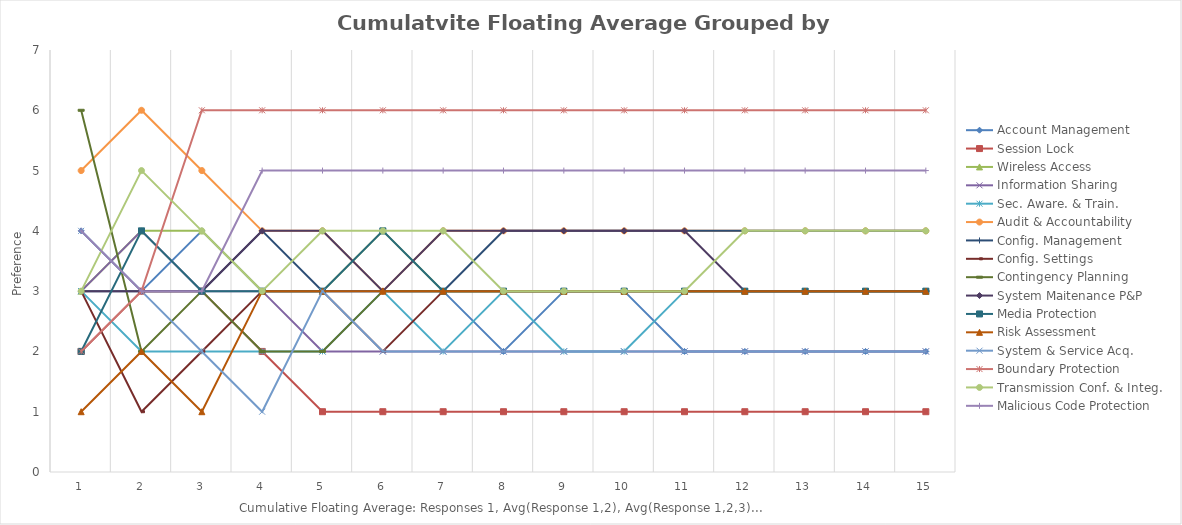
| Category | Account Management | Session Lock | Wireless Access | Information Sharing | Sec. Aware. & Train. | Audit & Accountability | Config. Management | Config. Settings | Contingency Planning | System Maitenance P&P | Media Protection | Risk Assessment | System & Service Acq. | Boundary Protection | Transmission Conf. & Integ. | Malicious Code Protection |
|---|---|---|---|---|---|---|---|---|---|---|---|---|---|---|---|---|
| 0 | 4 | 2 | 3 | 3 | 3 | 5 | 3 | 3 | 6 | 3 | 2 | 1 | 4 | 2 | 3 | 4 |
| 1 | 3 | 3 | 4 | 4 | 2 | 6 | 3 | 1 | 2 | 3 | 4 | 2 | 3 | 3 | 5 | 3 |
| 2 | 4 | 3 | 4 | 3 | 2 | 5 | 3 | 2 | 3 | 3 | 3 | 1 | 2 | 6 | 4 | 3 |
| 3 | 3 | 2 | 3 | 3 | 2 | 4 | 4 | 3 | 2 | 4 | 3 | 3 | 1 | 6 | 3 | 5 |
| 4 | 3 | 1 | 3 | 2 | 2 | 4 | 3 | 3 | 2 | 4 | 3 | 3 | 3 | 6 | 4 | 5 |
| 5 | 3 | 1 | 4 | 2 | 3 | 3 | 3 | 2 | 3 | 3 | 4 | 3 | 2 | 6 | 4 | 5 |
| 6 | 3 | 1 | 3 | 2 | 2 | 4 | 3 | 3 | 3 | 4 | 3 | 3 | 2 | 6 | 4 | 5 |
| 7 | 2 | 1 | 3 | 2 | 3 | 4 | 4 | 3 | 3 | 4 | 3 | 3 | 2 | 6 | 3 | 5 |
| 8 | 3 | 1 | 3 | 2 | 2 | 4 | 4 | 3 | 3 | 4 | 3 | 3 | 2 | 6 | 3 | 5 |
| 9 | 3 | 1 | 3 | 2 | 2 | 4 | 4 | 3 | 3 | 4 | 3 | 3 | 2 | 6 | 3 | 5 |
| 10 | 2 | 1 | 3 | 2 | 3 | 4 | 4 | 3 | 3 | 4 | 3 | 3 | 2 | 6 | 3 | 5 |
| 11 | 2 | 1 | 3 | 2 | 3 | 4 | 4 | 3 | 3 | 3 | 3 | 3 | 2 | 6 | 4 | 5 |
| 12 | 2 | 1 | 3 | 2 | 3 | 4 | 4 | 3 | 3 | 3 | 3 | 3 | 2 | 6 | 4 | 5 |
| 13 | 2 | 1 | 3 | 2 | 3 | 4 | 4 | 3 | 3 | 3 | 3 | 3 | 2 | 6 | 4 | 5 |
| 14 | 2 | 1 | 3 | 2 | 3 | 4 | 4 | 3 | 3 | 3 | 3 | 3 | 2 | 6 | 4 | 5 |